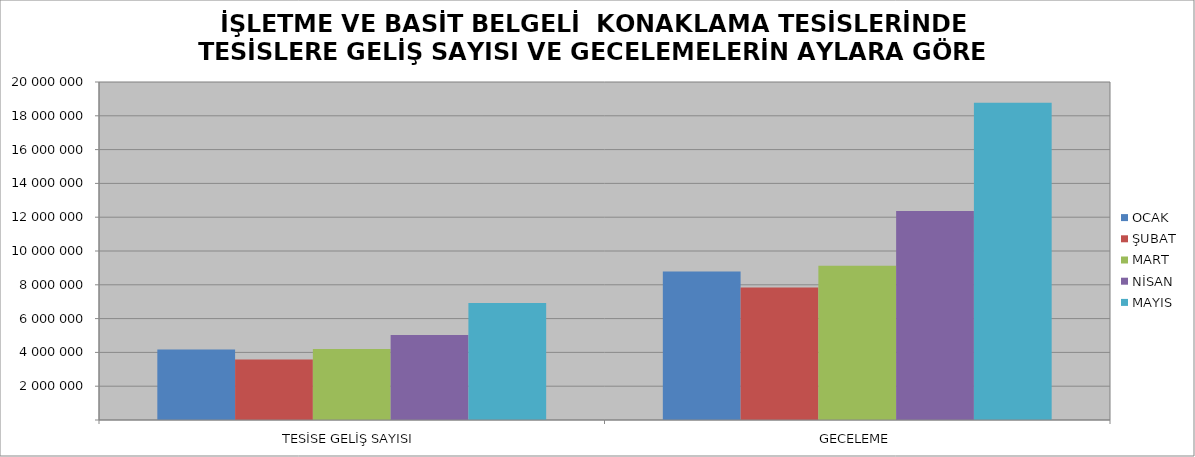
| Category | OCAK | ŞUBAT | MART | NİSAN | MAYIS |
|---|---|---|---|---|---|
| TESİSE GELİŞ SAYISI | 4176369 | 3577989 | 4200030 | 5022587 | 6927000 |
| GECELEME | 8783046 | 7837722 | 9122802 | 12360237 | 18778808 |